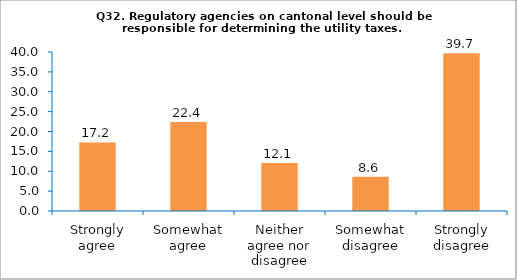
| Category | Series 0 |
|---|---|
| Strongly agree | 17.241 |
| Somewhat agree | 22.414 |
| Neither agree nor disagree | 12.069 |
| Somewhat disagree | 8.621 |
| Strongly disagree | 39.655 |